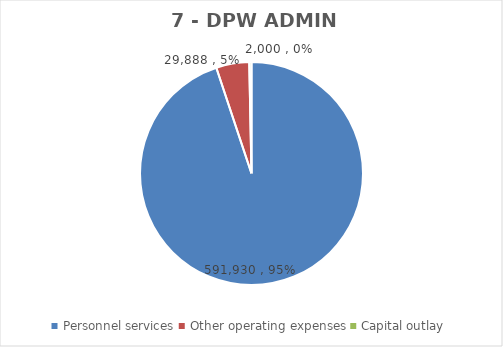
| Category | Series 0 | Series 1 | Series 2 | Series 3 | Series 4 | Series 5 | Series 6 |
|---|---|---|---|---|---|---|---|
| Personnel services | 591930 |  |  | 527334 | 529689 | 543845 | 591930 |
| Other operating expenses | 29888 |  |  | 24199 | 24224 | 28868 | 29888 |
| Capital outlay | 2000 |  |  | 1093 | 2000 | 2000 | 2000 |